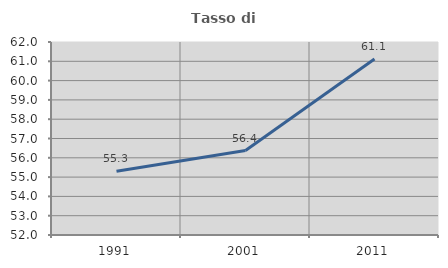
| Category | Tasso di occupazione   |
|---|---|
| 1991.0 | 55.306 |
| 2001.0 | 56.374 |
| 2011.0 | 61.117 |